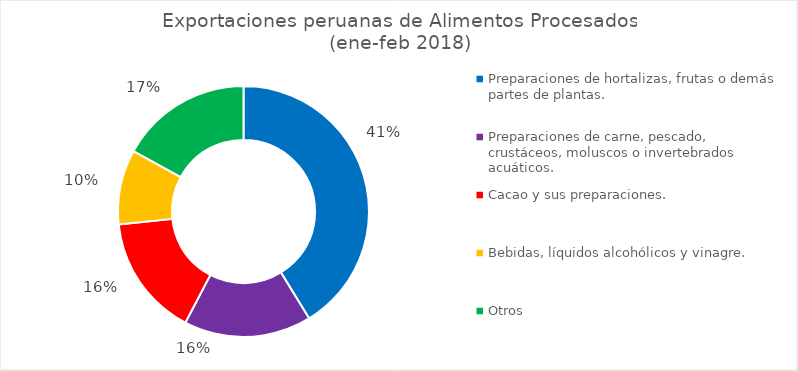
| Category | Series 0 |
|---|---|
| Preparaciones de hortalizas, frutas o demás partes de plantas. | 0.412 |
| Preparaciones de carne, pescado, crustáceos, moluscos o invertebrados acuáticos. | 0.164 |
| Cacao y sus preparaciones. | 0.157 |
| Bebidas, líquidos alcohólicos y vinagre. | 0.096 |
| Otros | 0.17 |